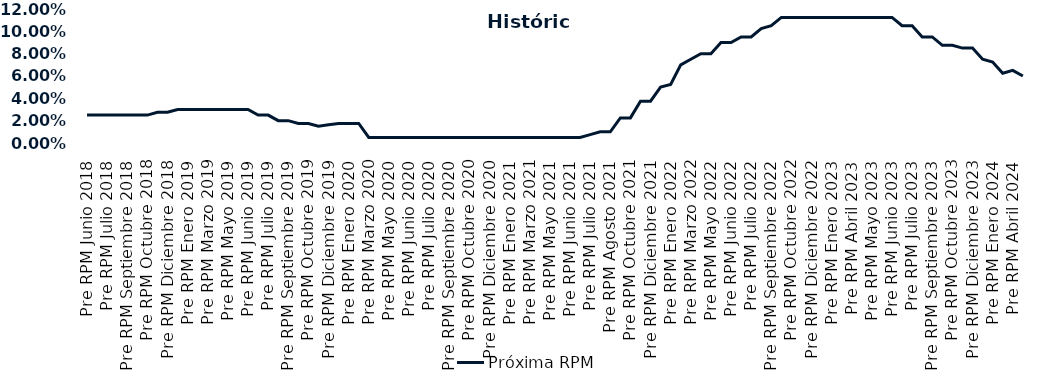
| Category | Próxima RPM |
|---|---|
| Pre RPM Junio 2018 | 0.025 |
| Post RPM Junio 2018 | 0.025 |
| Pre RPM Julio 2018 | 0.025 |
| Post RPM Julio 2018 | 0.025 |
| Pre RPM Septiembre 2018 | 0.025 |
| Post RPM Septiembre 2018 | 0.025 |
| Pre RPM Octubre 2018 | 0.025 |
| Post RPM Octubre 2018 | 0.028 |
| Pre RPM Diciembre 2018 | 0.028 |
| Post RPM Diciembre 2018 | 0.03 |
| Pre RPM Enero 2019 | 0.03 |
| Post RPM Enero 2019 | 0.03 |
| Pre RPM Marzo 2019 | 0.03 |
| Post RPM Marzo 2019 | 0.03 |
| Pre RPM Mayo 2019 | 0.03 |
| Post RPM Mayo 2019 | 0.03 |
| Pre RPM Junio 2019 | 0.03 |
| Post RPM Junio 2019 | 0.025 |
| Pre RPM Julio 2019 | 0.025 |
| Post RPM Julio 2019 | 0.02 |
| Pre RPM Septiembre 2019 | 0.02 |
| Post RPM Septiembre 2019 | 0.018 |
| Pre RPM Octubre 2019 | 0.018 |
| Post RPM Octubre 2019 | 0.015 |
| Pre RPM Diciembre 2019 | 0.016 |
| Post RPM Diciembre 2019 | 0.018 |
| Pre RPM Enero 2020 | 0.018 |
| Post RPM Enero 2020 | 0.018 |
| Pre RPM Marzo 2020 | 0.005 |
| Post RPM Marzo 2020 | 0.005 |
| Pre RPM Mayo 2020 | 0.005 |
| Post RPM Mayo 2020 | 0.005 |
| Pre RPM Junio 2020 | 0.005 |
| Post RPM Junio 2020 | 0.005 |
| Pre RPM Julio 2020 | 0.005 |
| Post RPM Julio 2020 | 0.005 |
| Pre RPM Septiembre 2020 | 0.005 |
| Post RPM Septiembre 2020 | 0.005 |
| Pre RPM Octubre 2020 | 0.005 |
| Post RPM Octubre 2020 | 0.005 |
| Pre RPM Diciembre 2020 | 0.005 |
| Post RPM Diciembre 2020 | 0.005 |
| Pre RPM Enero 2021 | 0.005 |
| Post RPM Enero 2021 | 0.005 |
| Pre RPM Marzo 2021 | 0.005 |
| Post RPM Marzo 2021 | 0.005 |
| Pre RPM Mayo 2021 | 0.005 |
| Post RPM Mayo 2021 | 0.005 |
| Pre RPM Junio 2021 | 0.005 |
| Post RPM Junio 2021 | 0.005 |
| Pre RPM Julio 2021 | 0.008 |
| Post RPM Julio 2021 | 0.01 |
| Pre RPM Agosto 2021 | 0.01 |
| Post RPM Agosto 2021 | 0.022 |
| Pre RPM Octubre 2021 | 0.022 |
| Post RPM Octubre 2021 | 0.038 |
| Pre RPM Diciembre 2021 | 0.038 |
| Post RPM Diciembre 2021 | 0.05 |
| Pre RPM Enero 2022 | 0.052 |
| Post RPM Enero 2022 | 0.07 |
| Pre RPM Marzo 2022 | 0.075 |
| Post RPM Marzo 2022 | 0.08 |
| Pre RPM Mayo 2022 | 0.08 |
| Post RPM Mayo 2022 | 0.09 |
| Pre RPM Junio 2022 | 0.09 |
| Post RPM Junio 2022 | 0.095 |
| Pre RPM Julio 2022 | 0.095 |
| Post RPM Julio 2022 | 0.102 |
| Pre RPM Septiembre 2022 | 0.105 |
| Post RPM Septiembre 2022 | 0.112 |
| Pre RPM Octubre 2022 | 0.112 |
| Post RPM Octubre 2022 | 0.112 |
| Pre RPM Diciembre 2022 | 0.112 |
| Post RPM Diciembre 2022 | 0.112 |
| Pre RPM Enero 2023 | 0.112 |
| Post RPM Enero 2023 | 0.112 |
| Pre RPM Abril 2023 | 0.112 |
| Post RPM Abril 2023 | 0.112 |
| Pre RPM Mayo 2023 | 0.112 |
| Post RPM Mayo 2023 | 0.112 |
| Pre RPM Junio 2023 | 0.112 |
| Post RPM Junio 2023 | 0.105 |
| Pre RPM Julio 2023 | 0.105 |
| Post RPM Julio 2023 | 0.095 |
| Pre RPM Septiembre 2023 | 0.095 |
| Post RPM Septiembre 2023 | 0.088 |
| Pre RPM Octubre 2023 | 0.088 |
| Post RPM Octubre 2023 | 0.085 |
| Pre RPM Diciembre 2023 | 0.085 |
| Post RPM Diciembre 2023 | 0.075 |
| Pre RPM Enero 2024 | 0.072 |
| Post RPM Enero 2024 | 0.062 |
| Pre RPM Abril 2024 | 0.065 |
| Post RPM Abril 2024 | 0.06 |